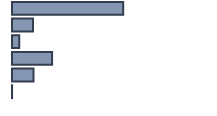
| Category | Series 0 |
|---|---|
| 0 | 55.315 |
| 1 | 10.419 |
| 2 | 3.583 |
| 3 | 19.941 |
| 4 | 10.705 |
| 5 | 0.037 |